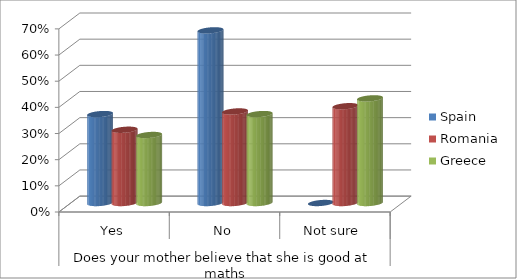
| Category | Spain | Romania | Greece |
|---|---|---|---|
| 0 | 0.34 | 0.28 | 0.26 |
| 1 | 0.66 | 0.35 | 0.34 |
| 2 | 0 | 0.37 | 0.4 |